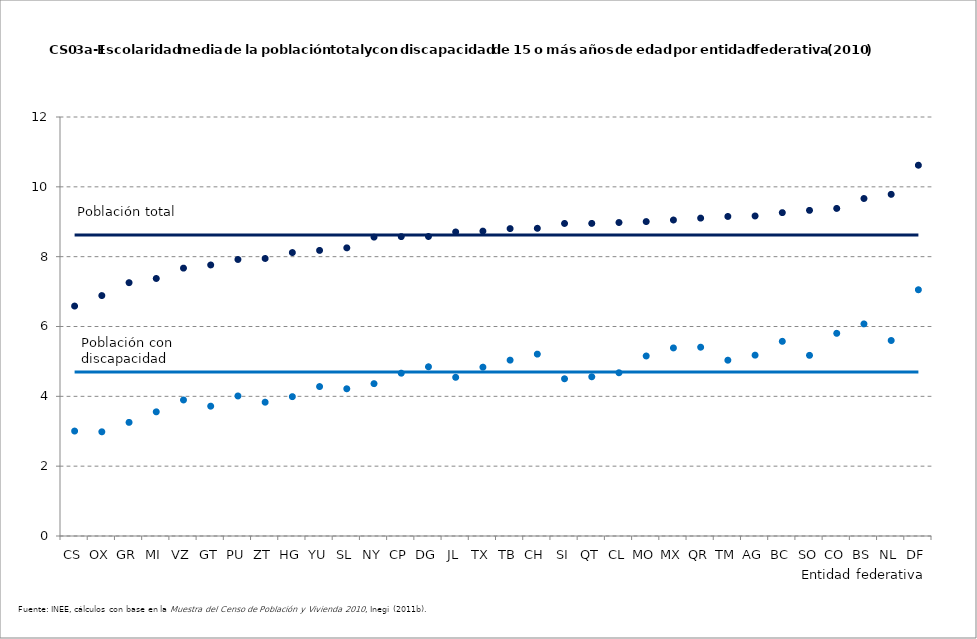
| Category | Series 0 | Series 1 | Series 2 | Series 3 |
|---|---|---|---|---|
| CS | 6.585 | 8.619 | 3.006 | 4.698 |
| OX | 6.886 | 8.619 | 2.984 | 4.698 |
| GR | 7.255 | 8.619 | 3.254 | 4.698 |
| MI | 7.376 | 8.619 | 3.556 | 4.698 |
| VZ | 7.672 | 8.619 | 3.896 | 4.698 |
| GT | 7.762 | 8.619 | 3.718 | 4.698 |
| PU | 7.919 | 8.619 | 4.01 | 4.698 |
| ZT | 7.948 | 8.619 | 3.832 | 4.698 |
| HG | 8.117 | 8.619 | 3.99 | 4.698 |
| YU | 8.18 | 8.619 | 4.28 | 4.698 |
| SL | 8.253 | 8.619 | 4.216 | 4.698 |
| NY | 8.56 | 8.619 | 4.363 | 4.698 |
| CP | 8.574 | 8.619 | 4.663 | 4.698 |
| DG | 8.578 | 8.619 | 4.846 | 4.698 |
| JL | 8.707 | 8.619 | 4.545 | 4.698 |
| TX | 8.732 | 8.619 | 4.835 | 4.698 |
| TB | 8.803 | 8.619 | 5.036 | 4.698 |
| CH | 8.813 | 8.619 | 5.209 | 4.698 |
| SI | 8.951 | 8.619 | 4.502 | 4.698 |
| QT | 8.953 | 8.619 | 4.56 | 4.698 |
| CL | 8.978 | 8.619 | 4.675 | 4.698 |
| MO | 9.004 | 8.619 | 5.156 | 4.698 |
| MX | 9.05 | 8.619 | 5.386 | 4.698 |
| QR | 9.104 | 8.619 | 5.407 | 4.698 |
| TM | 9.151 | 8.619 | 5.034 | 4.698 |
| AG | 9.166 | 8.619 | 5.179 | 4.698 |
| BC | 9.261 | 8.619 | 5.575 | 4.698 |
| SO | 9.326 | 8.619 | 5.174 | 4.698 |
| CO | 9.382 | 8.619 | 5.804 | 4.698 |
| BS | 9.666 | 8.619 | 6.074 | 4.698 |
| NL | 9.785 | 8.619 | 5.599 | 4.698 |
| DF | 10.619 | 8.619 | 7.052 | 4.698 |